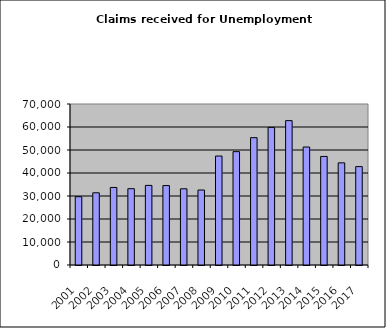
| Category | Series 1 |
|---|---|
| 2001.0 | 29694 |
| 2002.0 | 31386 |
| 2003.0 | 33712 |
| 2004.0 | 33179 |
| 2005.0 | 34612 |
| 2006.0 | 34527 |
| 2007.0 | 33131 |
| 2008.0 | 32607 |
| 2009.0 | 47377 |
| 2010.0 | 49282 |
| 2011.0 | 55358 |
| 2012.0 | 59832 |
| 2013.0 | 62771 |
| 2014.0 | 51290 |
| 2015.0 | 47204 |
| 2016.0 | 44413 |
| 2017.0 | 42782 |